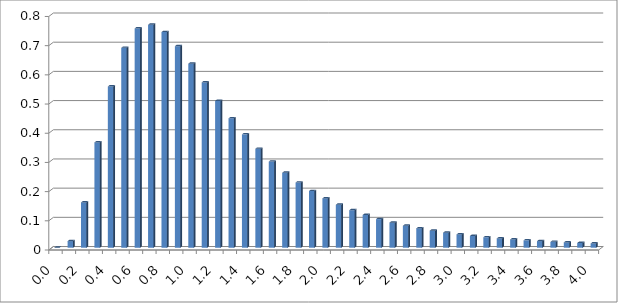
| Category | Series 0 |
|---|---|
| 0.0 | 0 |
| 0.1 | 0.022 |
| 0.2 | 0.155 |
| 0.3 | 0.361 |
| 0.4 | 0.552 |
| 0.5 | 0.685 |
| 0.6 | 0.751 |
| 0.7 | 0.764 |
| 0.8 | 0.739 |
| 0.9 | 0.69 |
| 1.0 | 0.63 |
| 1.1 | 0.566 |
| 1.2 | 0.503 |
| 1.3 | 0.443 |
| 1.4 | 0.388 |
| 1.5 | 0.339 |
| 1.6 | 0.295 |
| 1.7 | 0.257 |
| 1.8 | 0.223 |
| 1.9 | 0.194 |
| 2.0 | 0.169 |
| 2.1 | 0.147 |
| 2.2 | 0.128 |
| 2.3 | 0.112 |
| 2.4 | 0.098 |
| 2.5 | 0.086 |
| 2.6 | 0.075 |
| 2.7 | 0.066 |
| 2.8 | 0.058 |
| 2.9 | 0.051 |
| 3.0 | 0.045 |
| 3.1 | 0.04 |
| 3.2 | 0.036 |
| 3.3 | 0.032 |
| 3.4 | 0.028 |
| 3.5 | 0.025 |
| 3.6 | 0.022 |
| 3.7 | 0.02 |
| 3.8 | 0.018 |
| 3.9 | 0.016 |
| 4.0 | 0.015 |